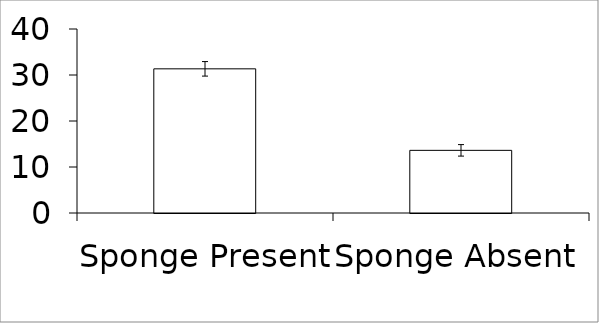
| Category | Series 0 |
|---|---|
| Sponge Present | 31.34 |
| Sponge Absent | 13.62 |